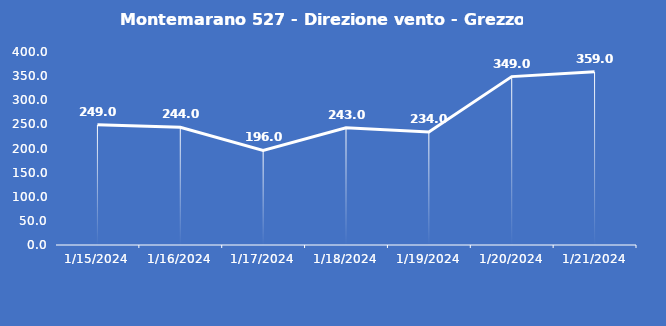
| Category | Montemarano 527 - Direzione vento - Grezzo (°N) |
|---|---|
| 1/15/24 | 249 |
| 1/16/24 | 244 |
| 1/17/24 | 196 |
| 1/18/24 | 243 |
| 1/19/24 | 234 |
| 1/20/24 | 349 |
| 1/21/24 | 359 |